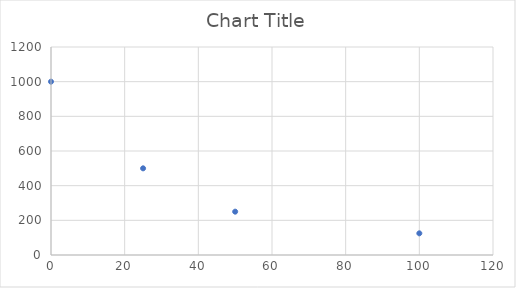
| Category | Series 0 |
|---|---|
| 0.0 | 1000 |
| 25.0 | 500 |
| 50.0 | 250 |
| 100.0 | 125 |